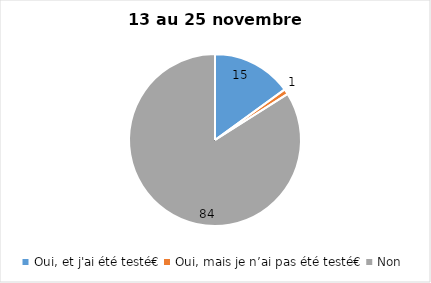
| Category | Series 0 |
|---|---|
| Oui, et j'ai été testé€ | 15 |
| Oui, mais je n’ai pas été testé€ | 1 |
| Non | 84 |